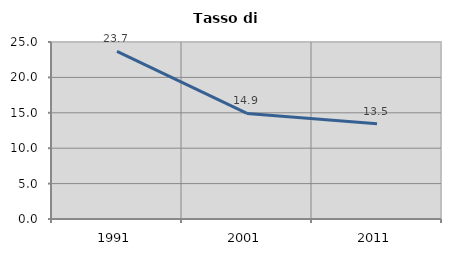
| Category | Tasso di disoccupazione   |
|---|---|
| 1991.0 | 23.676 |
| 2001.0 | 14.906 |
| 2011.0 | 13.455 |